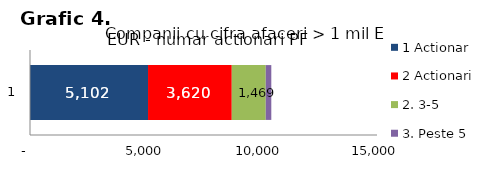
| Category | 1 Actionar | 2 Actionari | 2. 3-5 | 3. Peste 5 |
|---|---|---|---|---|
| 0 | 5102 | 3620 | 1469 | 240 |